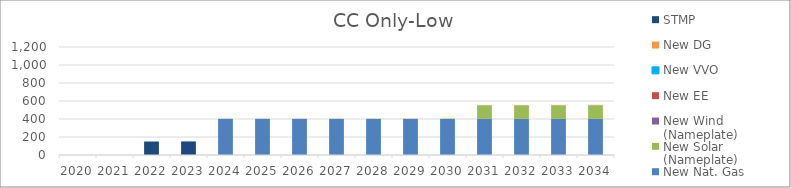
| Category | New Nat. Gas | New Solar (Nameplate) | New Wind (Nameplate) | New EE | New VVO | New DG | STMP |
|---|---|---|---|---|---|---|---|
| 2020.0 | 0 | 0 | 0 | 0 | 0 | 0 | 0 |
| 2021.0 | 0 | 0 | 0 | 0 | 0 | 0 | 0 |
| 2022.0 | 0 | 0 | 0 | 0 | 0 | 0 | 150 |
| 2023.0 | 0 | 0 | 0 | 0 | 0 | 1.022 | 150 |
| 2024.0 | 401 | 0 | 0 | 0 | 0 | 1.533 | 0 |
| 2025.0 | 401 | 0 | 0 | 0 | 0 | 1.533 | 0 |
| 2026.0 | 401 | 0 | 0 | 0 | 0 | 1.533 | 0 |
| 2027.0 | 401 | 0 | 0 | 0 | 0 | 2.044 | 0 |
| 2028.0 | 401 | 0 | 0 | 0 | 0 | 2.044 | 0 |
| 2029.0 | 401 | 0 | 0 | 0 | 0 | 2.555 | 0 |
| 2030.0 | 401 | 0 | 0 | 0 | 0 | 3.066 | 0 |
| 2031.0 | 401 | 151.796 | 0 | 0 | 0 | 3.577 | 0 |
| 2032.0 | 401 | 151.796 | 0 | 0 | 0 | 3.577 | 0 |
| 2033.0 | 401 | 151.796 | 0 | 0 | 0 | 4.088 | 0 |
| 2034.0 | 401 | 151.796 | 0 | 0 | 0 | 4.599 | 0 |